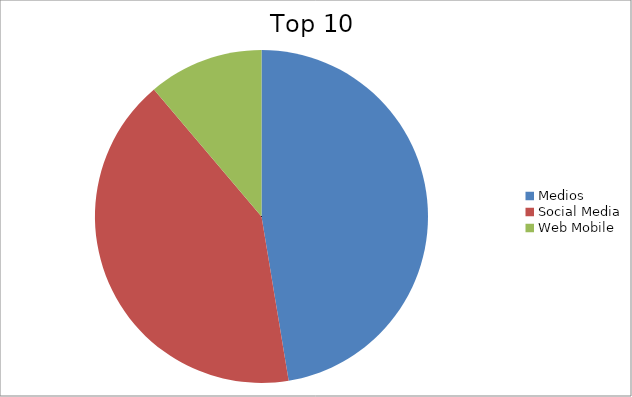
| Category | Series 0 |
|---|---|
| Medios | 47.39 |
| Social Media | 41.43 |
| Web Mobile | 11.18 |